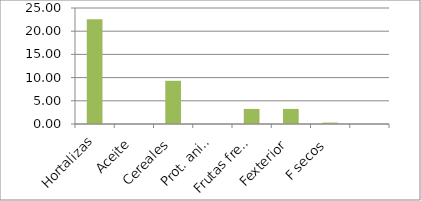
| Category | Series 0 |
|---|---|
| Hortalizas | 22.563 |
| Aceite | 0 |
| Cereales | 9.314 |
| Prot. animal | 0 |
| Frutas frescas | 3.252 |
| Fexterior | 3.252 |
|      F secos | 0.303 |